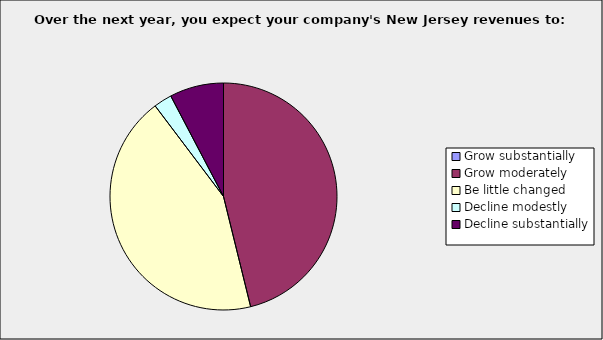
| Category | Series 0 |
|---|---|
| Grow substantially | 0 |
| Grow moderately | 0.462 |
| Be little changed | 0.436 |
| Decline modestly | 0.026 |
| Decline substantially | 0.077 |